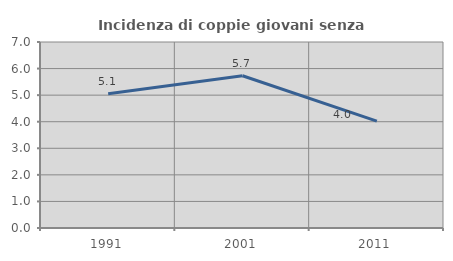
| Category | Incidenza di coppie giovani senza figli |
|---|---|
| 1991.0 | 5.056 |
| 2001.0 | 5.729 |
| 2011.0 | 4.02 |